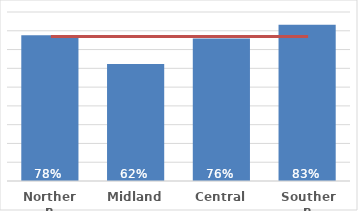
| Category | Pacific |
|---|---|
| Northern | 0.776 |
| Midland | 0.623 |
| Central | 0.759 |
| Southern | 0.832 |